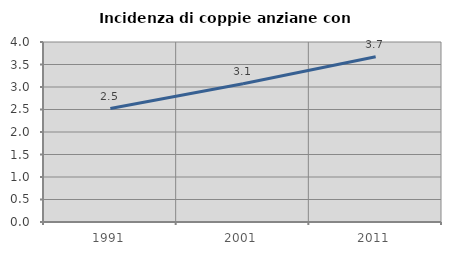
| Category | Incidenza di coppie anziane con figli |
|---|---|
| 1991.0 | 2.521 |
| 2001.0 | 3.073 |
| 2011.0 | 3.673 |